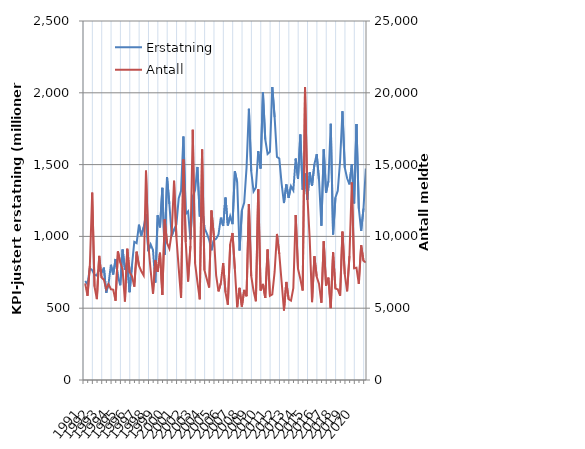
| Category | Erstatning |
|---|---|
| 1991.0 | 689.374 |
| nan | 666.894 |
| nan | 778.133 |
| nan | 764.907 |
| 1992.0 | 731.882 |
| nan | 727.208 |
| nan | 776.459 |
| nan | 745.324 |
| 1993.0 | 782.622 |
| nan | 607.8 |
| nan | 670.591 |
| nan | 802.547 |
| 1994.0 | 734.838 |
| nan | 842.978 |
| nan | 722.495 |
| nan | 659.654 |
| 1995.0 | 909.176 |
| nan | 768.464 |
| nan | 810.842 |
| nan | 611.488 |
| 1996.0 | 796.7 |
| nan | 962.483 |
| nan | 952.884 |
| nan | 1081.216 |
| 1997.0 | 1005.654 |
| nan | 1063.482 |
| nan | 1152.959 |
| nan | 896.353 |
| 1998.0 | 944.295 |
| nan | 904.9 |
| nan | 678.191 |
| nan | 1147.03 |
| 1999.0 | 1062.77 |
| nan | 1338.301 |
| nan | 871.881 |
| nan | 1413.509 |
| 2000.0 | 1225.813 |
| nan | 1003.185 |
| nan | 1048.804 |
| nan | 1082.395 |
| 2001.0 | 1265.218 |
| nan | 1317.001 |
| nan | 1695.786 |
| nan | 1155.695 |
| 2002.0 | 1173.818 |
| nan | 979.681 |
| nan | 1278.333 |
| nan | 1322.228 |
| 2003.0 | 1483.611 |
| nan | 1138.839 |
| nan | 1202.166 |
| nan | 1058.724 |
| 2004.0 | 1021.086 |
| nan | 976.786 |
| nan | 903.296 |
| nan | 973.154 |
| 2005.0 | 983.699 |
| nan | 1012.023 |
| nan | 1130.564 |
| nan | 1072.855 |
| 2006.0 | 1270.393 |
| nan | 1075.992 |
| nan | 1141.091 |
| nan | 1085.496 |
| 2007.0 | 1453.648 |
| nan | 1377.06 |
| nan | 902.201 |
| nan | 1180.267 |
| 2008.0 | 1236.198 |
| nan | 1478.992 |
| nan | 1888.435 |
| nan | 1454.744 |
| 2009.0 | 1313.509 |
| nan | 1341.029 |
| nan | 1593.905 |
| nan | 1472.687 |
| 2010.0 | 2003.113 |
| nan | 1676.316 |
| nan | 1573.884 |
| nan | 1589.066 |
| 2011.0 | 2040.332 |
| nan | 1830.54 |
| nan | 1553.457 |
| nan | 1542.115 |
| 2012.0 | 1365.922 |
| nan | 1232.315 |
| nan | 1361.826 |
| nan | 1268.865 |
| 2013.0 | 1350.066 |
| nan | 1320.139 |
| nan | 1542.162 |
| nan | 1401.643 |
| 2014.0 | 1710.003 |
| nan | 1325.632 |
| nan | 1438.142 |
| nan | 1255.22 |
| 2015.0 | 1446.15 |
| nan | 1351.835 |
| nan | 1501.279 |
| nan | 1573.052 |
| 2016.0 | 1388.7 |
| nan | 1074.557 |
| nan | 1606.313 |
| nan | 1302.798 |
| 2017.0 | 1384.869 |
| nan | 1784.337 |
| nan | 1012.84 |
| nan | 1269.838 |
| 2018.0 | 1318.356 |
| nan | 1526.482 |
| nan | 1871.334 |
| nan | 1478.409 |
| 2019.0 | 1405.033 |
| nan | 1362.292 |
| nan | 1501.153 |
| nan | 1229.981 |
| 2020.0 | 1783.259 |
| nan | 1194.46 |